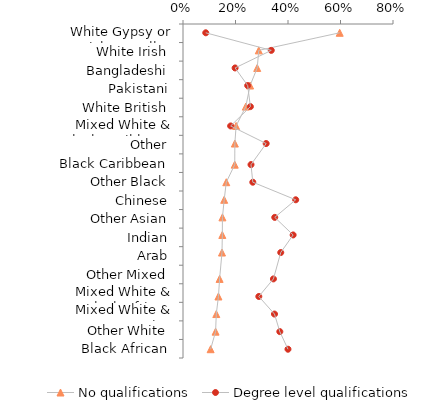
| Category | Series 0 |
|---|---|
| White Gypsy or Irish Traveller | 0.597 |
| White Irish | 0.289 |
| Bangladeshi | 0.283 |
| Pakistani | 0.256 |
| White British | 0.239 |
| Mixed White & Black Caribbean | 0.202 |
| Other | 0.198 |
| Black Caribbean | 0.197 |
| Other Black | 0.165 |
| Chinese | 0.157 |
| Other Asian | 0.15 |
| Indian | 0.15 |
| Arab | 0.149 |
| Other Mixed | 0.139 |
| Mixed White & Black African | 0.135 |
| Mixed White & Asian | 0.127 |
| Other White | 0.124 |
| Black African | 0.105 |